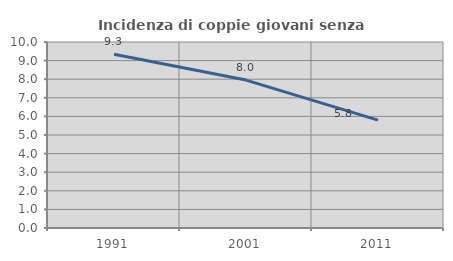
| Category | Incidenza di coppie giovani senza figli |
|---|---|
| 1991.0 | 9.346 |
| 2001.0 | 7.953 |
| 2011.0 | 5.798 |